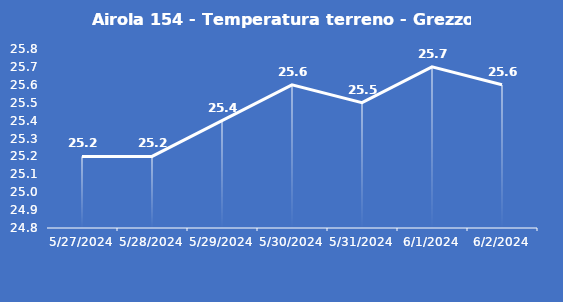
| Category | Airola 154 - Temperatura terreno - Grezzo (°C) |
|---|---|
| 5/27/24 | 25.2 |
| 5/28/24 | 25.2 |
| 5/29/24 | 25.4 |
| 5/30/24 | 25.6 |
| 5/31/24 | 25.5 |
| 6/1/24 | 25.7 |
| 6/2/24 | 25.6 |